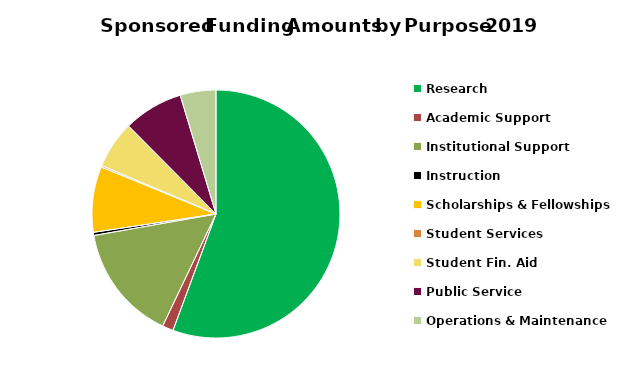
| Category | Series 0 |
|---|---|
| Research | 260927 |
| Academic Support | 6753 |
| Institutional Support | 71063 |
| Instruction | 1924 |
| Scholarships & Fellowships | 40094 |
| Student Services | 966 |
| Student Fin. Aid | 28872 |
| Public Service | 36579 |
| Operations & Maintenance | 21858 |